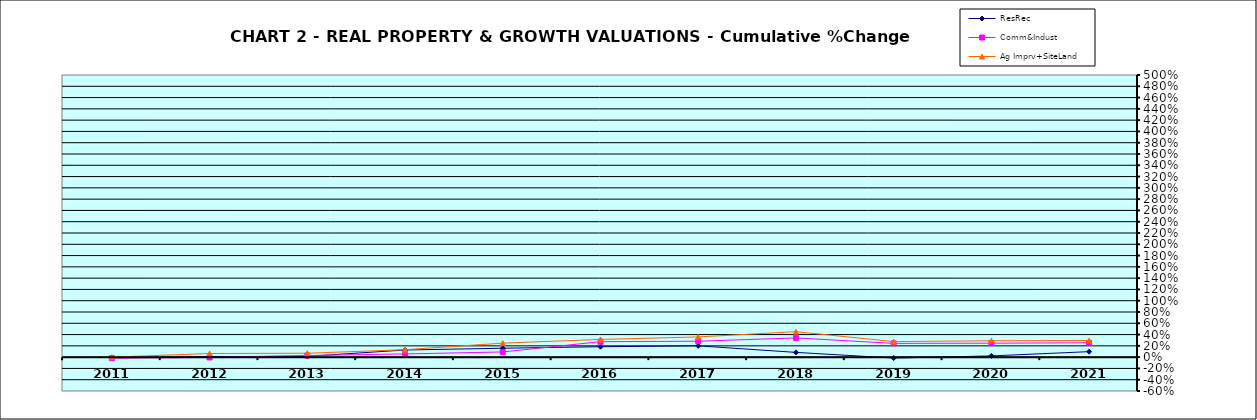
| Category | ResRec | Comm&Indust | Ag Imprv+SiteLand |
|---|---|---|---|
| 2011.0 | -0.013 | -0.018 | 0 |
| 2012.0 | 0.01 | -0.006 | 0.065 |
| 2013.0 | 0.014 | 0.029 | 0.069 |
| 2014.0 | 0.127 | 0.057 | 0.132 |
| 2015.0 | 0.158 | 0.092 | 0.248 |
| 2016.0 | 0.185 | 0.274 | 0.314 |
| 2017.0 | 0.2 | 0.282 | 0.358 |
| 2018.0 | 0.084 | 0.34 | 0.451 |
| 2019.0 | -0.016 | 0.244 | 0.276 |
| 2020.0 | 0.022 | 0.247 | 0.291 |
| 2021.0 | 0.097 | 0.254 | 0.295 |